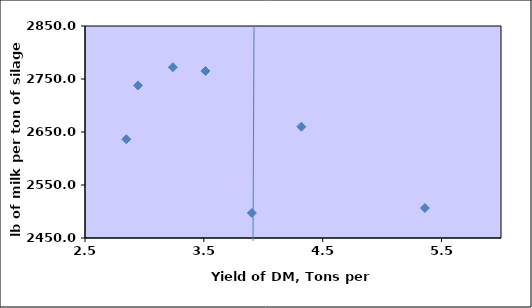
| Category | Series 0 |
|---|---|
| 3.23945871 | 2772.3 |
| 4.32041132 | 2660 |
| 3.51380872 | 2765 |
| 5.36 | 2506.5 |
| 3.90355429 | 2497.25 |
| 2.94651682 | 2737.8 |
| 2.84730395 | 2636.3 |